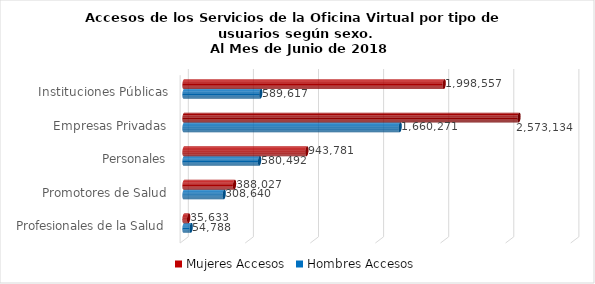
| Category | Mujeres | Hombres |
|---|---|---|
| Instituciones Públicas | 1998557 | 589617 |
| Empresas Privadas | 2573134 | 1660271 |
| Personales | 943781 | 580492 |
| Promotores de Salud | 388027 | 308640 |
| Profesionales de la Salud | 35633 | 54788 |